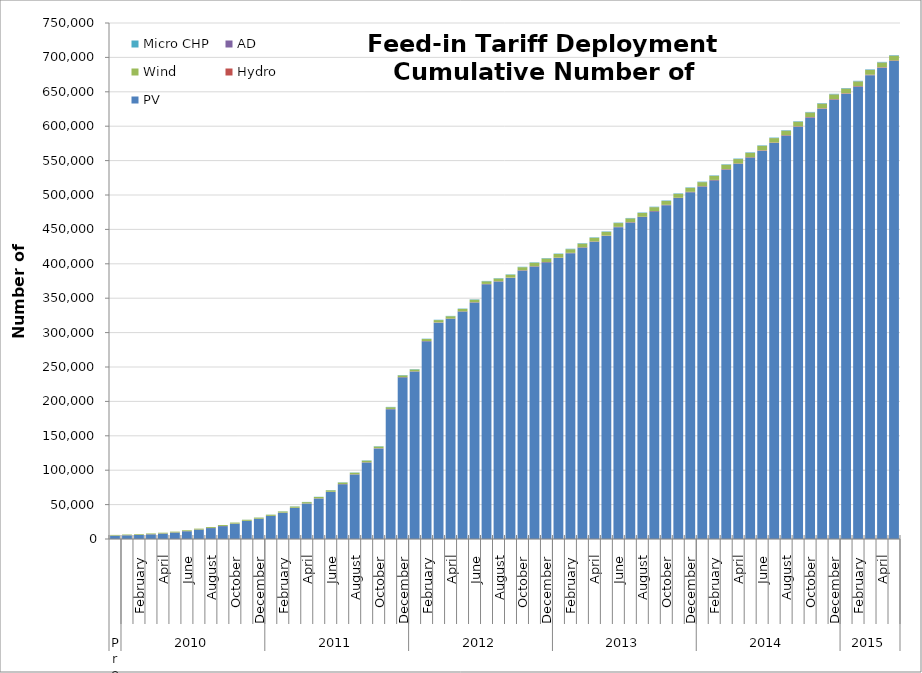
| Category | PV | Hydro | Wind | AD | Micro CHP |
|---|---|---|---|---|---|
| 0 | 4840 | 153 | 969 | 2 | 0 |
| 1 | 5374 | 154 | 992 | 2 | 0 |
| 2 | 5847 | 167 | 1027 | 2 | 0 |
| 3 | 6782 | 190 | 1082 | 3 | 0 |
| 4 | 7832 | 191 | 1119 | 3 | 0 |
| 5 | 9351 | 191 | 1169 | 3 | 0 |
| 6 | 11264 | 192 | 1222 | 4 | 6 |
| 7 | 13582 | 195 | 1279 | 5 | 16 |
| 8 | 15860 | 196 | 1333 | 6 | 25 |
| 9 | 18723 | 200 | 1390 | 6 | 38 |
| 10 | 22199 | 209 | 1472 | 6 | 56 |
| 11 | 26208 | 213 | 1551 | 6 | 92 |
| 12 | 29290 | 214 | 1594 | 6 | 125 |
| 13 | 33437 | 221 | 1649 | 7 | 152 |
| 14 | 38116 | 222 | 1706 | 7 | 196 |
| 15 | 45183 | 226 | 1797 | 9 | 241 |
| 16 | 51518 | 236 | 1868 | 10 | 266 |
| 17 | 58846 | 249 | 1957 | 12 | 293 |
| 18 | 68377 | 254 | 2160 | 13 | 312 |
| 19 | 79638 | 258 | 2222 | 13 | 332 |
| 20 | 93795 | 265 | 2290 | 15 | 357 |
| 21 | 111224 | 279 | 2384 | 15 | 399 |
| 22 | 131696 | 287 | 2458 | 16 | 428 |
| 23 | 188720 | 296 | 2535 | 17 | 444 |
| 24 | 234928 | 304 | 2614 | 20 | 456 |
| 25 | 243396 | 313 | 2745 | 22 | 461 |
| 26 | 287411 | 332 | 2902 | 22 | 466 |
| 27 | 314486 | 349 | 3339 | 22 | 476 |
| 28 | 320007 | 357 | 3411 | 24 | 484 |
| 29 | 330532 | 369 | 3527 | 28 | 496 |
| 30 | 343798 | 382 | 3671 | 31 | 513 |
| 31 | 370361 | 392 | 3797 | 36 | 519 |
| 32 | 374276 | 392 | 3961 | 37 | 522 |
| 33 | 379542 | 403 | 4165 | 41 | 532 |
| 34 | 390264 | 413 | 4400 | 44 | 547 |
| 35 | 396052 | 425 | 5155 | 45 | 561 |
| 36 | 402114 | 441 | 5173 | 48 | 569 |
| 37 | 408556 | 442 | 5208 | 50 | 580 |
| 38 | 415507 | 450 | 5273 | 52 | 584 |
| 39 | 423593 | 455 | 5318 | 53 | 587 |
| 40 | 432023 | 462 | 5341 | 55 | 592 |
| 41 | 440569 | 474 | 5381 | 55 | 592 |
| 42 | 453286 | 477 | 5420 | 60 | 593 |
| 43 | 460046 | 481 | 5456 | 63 | 594 |
| 44 | 467900 | 485 | 5490 | 67 | 594 |
| 45 | 476256 | 495 | 5564 | 70 | 594 |
| 46 | 485237 | 503 | 5622 | 73 | 596 |
| 47 | 495481 | 524 | 5691 | 78 | 600 |
| 48 | 504089 | 534 | 5756 | 84 | 603 |
| 49 | 512342 | 541 | 5806 | 85 | 608 |
| 50 | 521360 | 549 | 5889 | 89 | 610 |
| 51 | 537100 | 561 | 6339 | 96 | 615 |
| 52 | 545313 | 564 | 6359 | 97 | 615 |
| 53 | 554345 | 572 | 6389 | 99 | 615 |
| 54 | 564442 | 576 | 6426 | 103 | 615 |
| 55 | 575662 | 583 | 6459 | 104 | 617 |
| 56 | 586404 | 593 | 6496 | 113 | 619 |
| 57 | 599301 | 604 | 6599 | 121 | 621 |
| 58 | 612717 | 618 | 6644 | 127 | 625 |
| 59 | 625452 | 632 | 6702 | 145 | 628 |
| 60 | 638792 | 638 | 6814 | 167 | 629 |
| 61 | 647279 | 648 | 6814 | 167 | 635 |
| 62 | 657665 | 653 | 6826 | 167 | 642 |
| 63 | 674232 | 654 | 6895 | 168 | 643 |
| 64 | 685100 | 654 | 6895 | 168 | 645 |
| 65 | 694961 | 654 | 6896 | 168 | 645 |